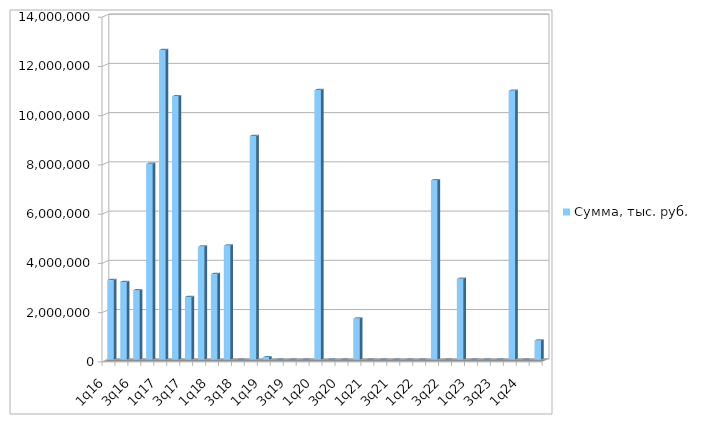
| Category | Сумма, тыс. руб. |
|---|---|
| 1q16 | 3230000 |
| 2q16 | 3157654 |
| 3q16 | 2822068 |
| 4q16 | 7952421 |
| 1q17 | 12572775 |
| 2q17 | 10698070 |
| 3q17 | 2546916 |
| 4q17 | 4591000 |
| 1q18 | 3475129 |
| 2q18 | 4634295 |
| 3q18 | 0 |
| 4q18 | 9083836 |
| 1q19 | 93790 |
| 2q19 | 0 |
| 3q19 | 0 |
| 4q19 | 0 |
| 1q20 | 10948000 |
| 2q20 | 0 |
| 3q20 | 0 |
| 4q20 | 1668684 |
| 1q21 | 0 |
| 2q21 | 0 |
| 3q21 | 0 |
| 4q21 | 0 |
| 1q22 | 0 |
| 2q22 | 7288270 |
| 3q22 | 0 |
| 4q22 | 3282741 |
| 1q23 | 0 |
| 2q23 | 0 |
| 3q23 | 0 |
| 4q23 | 10920420 |
| 1q24 | 0 |
| 2q24 | 779137 |